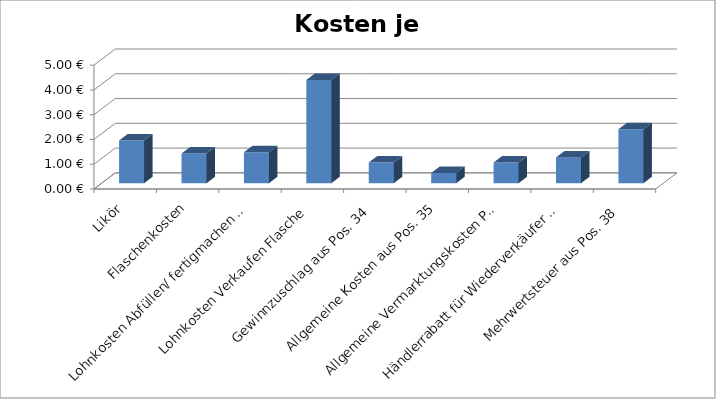
| Category | Kosten je Flasche |
|---|---|
| Likör | 1.727 |
| Flaschenkosten | 1.2 |
| Lohnkosten Abfüllen/ fertigmachen Flasche | 1.25 |
| Lohnkosten Verkaufen Flasche | 4.167 |
| Gewinnzuschlag aus Pos. 34 | 0.834 |
| Allgemeine Kosten aus Pos. 35 | 0.417 |
| Allgemeine Vermarktungskosten Pos. 36 | 0.834 |
| Händlerrabatt für Wiederverkäufer Pos. 37 | 1.043 |
| Mehrwertsteuer aus Pos. 38 | 2.18 |